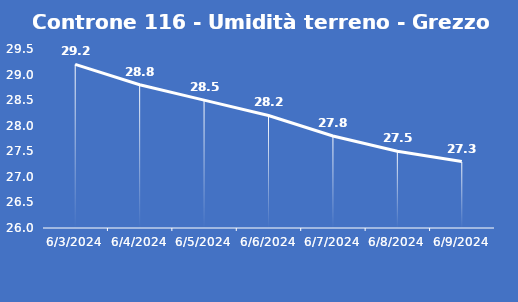
| Category | Controne 116 - Umidità terreno - Grezzo (%VWC) |
|---|---|
| 6/3/24 | 29.2 |
| 6/4/24 | 28.8 |
| 6/5/24 | 28.5 |
| 6/6/24 | 28.2 |
| 6/7/24 | 27.8 |
| 6/8/24 | 27.5 |
| 6/9/24 | 27.3 |